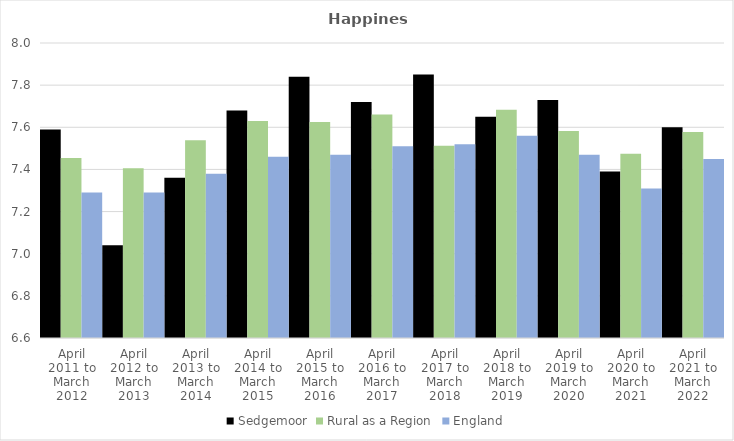
| Category | Sedgemoor | Rural as a Region | England |
|---|---|---|---|
| April 2011 to March 2012 | 7.59 | 7.454 | 7.29 |
| April 2012 to March 2013 | 7.04 | 7.406 | 7.29 |
| April 2013 to March 2014 | 7.36 | 7.539 | 7.38 |
| April 2014 to March 2015 | 7.68 | 7.63 | 7.46 |
| April 2015 to March 2016 | 7.84 | 7.625 | 7.47 |
| April 2016 to March 2017 | 7.72 | 7.661 | 7.51 |
| April 2017 to March 2018 | 7.85 | 7.513 | 7.52 |
| April 2018 to March 2019 | 7.65 | 7.684 | 7.56 |
| April 2019 to March 2020 | 7.73 | 7.582 | 7.47 |
| April 2020 to March 2021 | 7.39 | 7.474 | 7.31 |
| April 2021 to March 2022 | 7.6 | 7.577 | 7.45 |